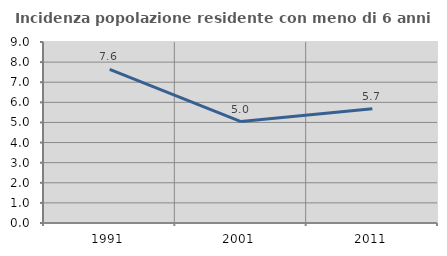
| Category | Incidenza popolazione residente con meno di 6 anni |
|---|---|
| 1991.0 | 7.639 |
| 2001.0 | 5.043 |
| 2011.0 | 5.68 |